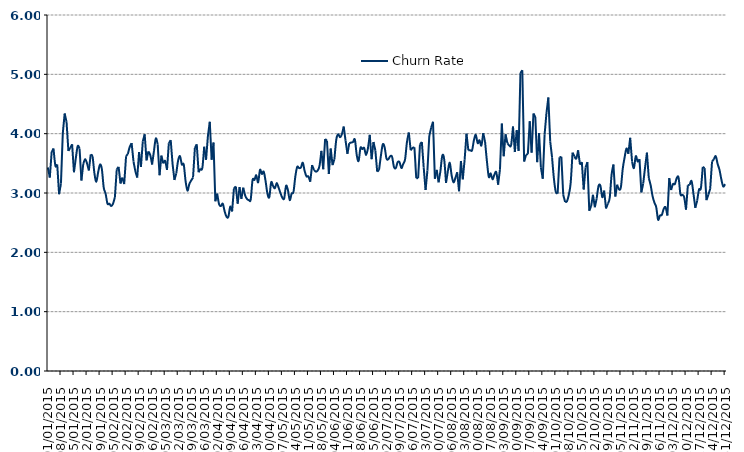
| Category | Churn Rate |
|---|---|
| 01/01/2013 | 0 |
| 02/01/2013 | 0 |